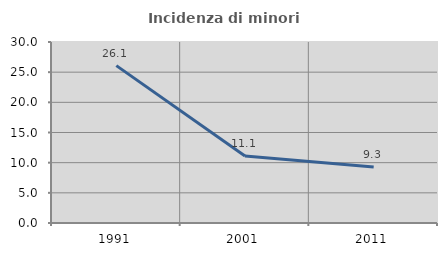
| Category | Incidenza di minori stranieri |
|---|---|
| 1991.0 | 26.087 |
| 2001.0 | 11.111 |
| 2011.0 | 9.296 |